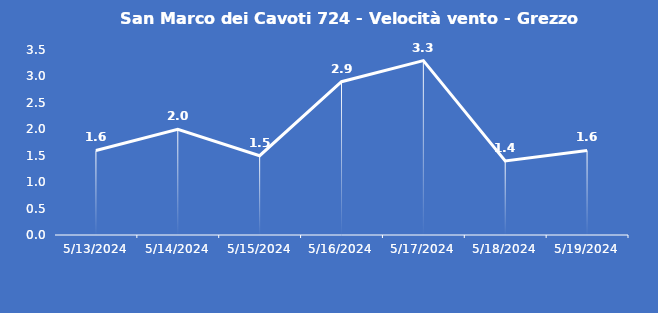
| Category | San Marco dei Cavoti 724 - Velocità vento - Grezzo (m/s) |
|---|---|
| 5/13/24 | 1.6 |
| 5/14/24 | 2 |
| 5/15/24 | 1.5 |
| 5/16/24 | 2.9 |
| 5/17/24 | 3.3 |
| 5/18/24 | 1.4 |
| 5/19/24 | 1.6 |